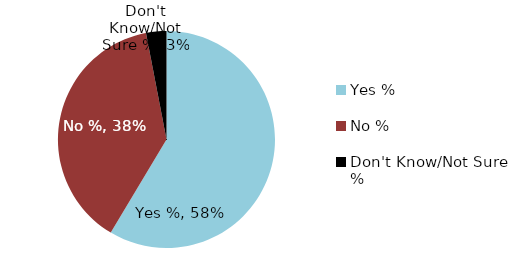
| Category | Yes % |
|---|---|
| Yes % | 0.58 |
| No % | 0.38 |
| Don't Know/Not Sure % | 0.03 |